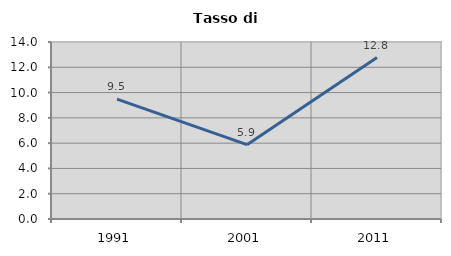
| Category | Tasso di disoccupazione   |
|---|---|
| 1991.0 | 9.48 |
| 2001.0 | 5.882 |
| 2011.0 | 12.766 |